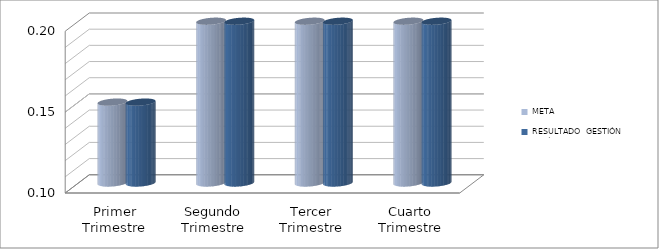
| Category | META | RESULTADO  GESTIÓN PERÍODO |
|---|---|---|
| Primer Trimestre | 0.15 | 0.15 |
| Segundo Trimestre | 0.3 | 0.3 |
| Tercer Trimestre | 0.3 | 0.3 |
| Cuarto Trimestre | 0.25 | 0.25 |